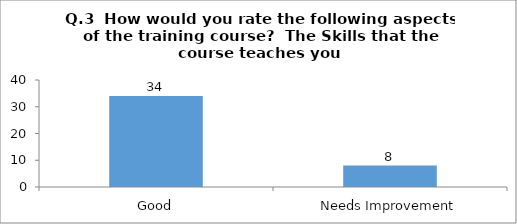
| Category | Q.3  How would you rate the following aspects of the training course?  |
|---|---|
| Good | 34 |
| Needs Improvement | 8 |